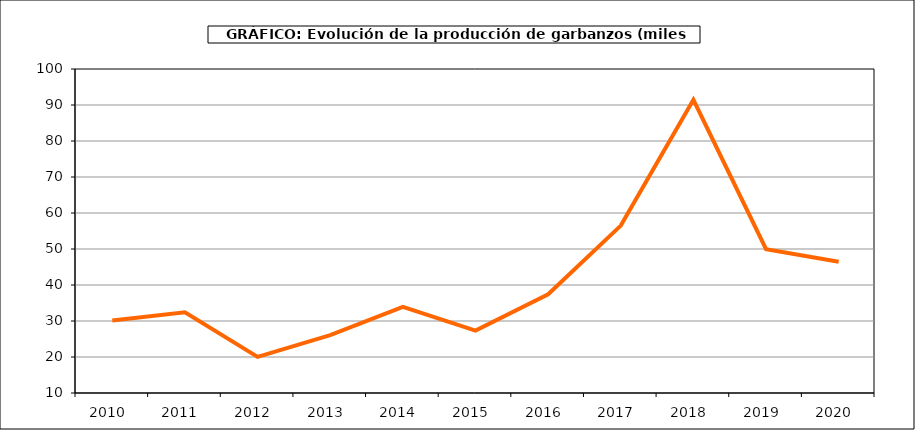
| Category | Superficie |
|---|---|
| 2010.0 | 30.143 |
| 2011.0 | 32.408 |
| 2012.0 | 20.03 |
| 2013.0 | 26.073 |
| 2014.0 | 33.954 |
| 2015.0 | 27.348 |
| 2016.0 | 37.42 |
| 2017.0 | 56.498 |
| 2018.0 | 91.456 |
| 2019.0 | 49.971 |
| 2020.0 | 46.454 |